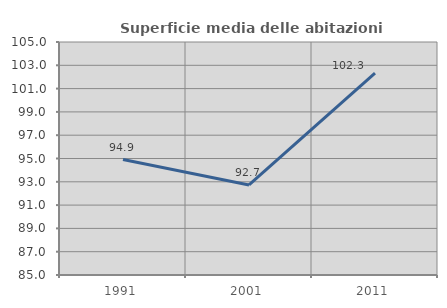
| Category | Superficie media delle abitazioni occupate |
|---|---|
| 1991.0 | 94.908 |
| 2001.0 | 92.726 |
| 2011.0 | 102.337 |